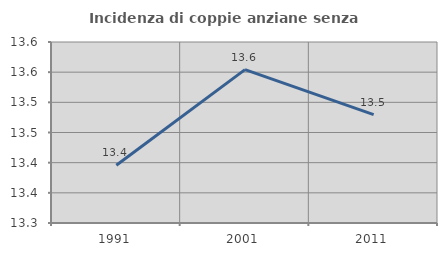
| Category | Incidenza di coppie anziane senza figli  |
|---|---|
| 1991.0 | 13.396 |
| 2001.0 | 13.554 |
| 2011.0 | 13.48 |